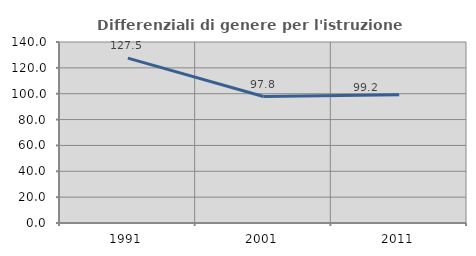
| Category | Differenziali di genere per l'istruzione superiore |
|---|---|
| 1991.0 | 127.527 |
| 2001.0 | 97.796 |
| 2011.0 | 99.178 |